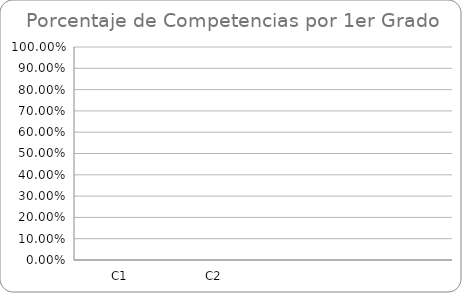
| Category | Series 0 | Series 1 | Series 2 | Series 3 |
|---|---|---|---|---|
| C1 |  |  |  | 0 |
| C2 |  |  |  | 0 |